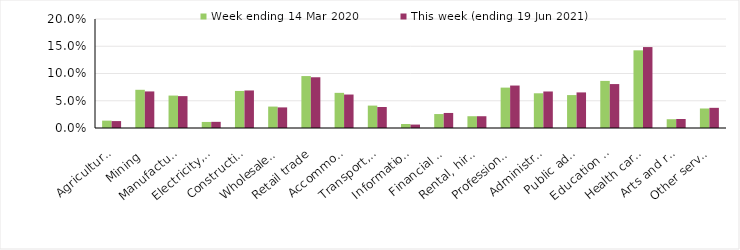
| Category | Week ending 14 Mar 2020 | This week (ending 19 Jun 2021) |
|---|---|---|
| Agriculture, forestry and fishing | 0.014 | 0.013 |
| Mining | 0.07 | 0.067 |
| Manufacturing | 0.06 | 0.058 |
| Electricity, gas, water and waste services | 0.011 | 0.011 |
| Construction | 0.068 | 0.069 |
| Wholesale trade | 0.039 | 0.038 |
| Retail trade | 0.095 | 0.093 |
| Accommodation and food services | 0.064 | 0.061 |
| Transport, postal and warehousing | 0.041 | 0.038 |
| Information media and telecommunications | 0.007 | 0.006 |
| Financial and insurance services | 0.026 | 0.028 |
| Rental, hiring and real estate services | 0.022 | 0.022 |
| Professional, scientific and technical services | 0.074 | 0.078 |
| Administrative and support services | 0.064 | 0.067 |
| Public administration and safety | 0.06 | 0.065 |
| Education and training | 0.086 | 0.081 |
| Health care and social assistance | 0.142 | 0.148 |
| Arts and recreation services | 0.016 | 0.016 |
| Other services | 0.036 | 0.037 |